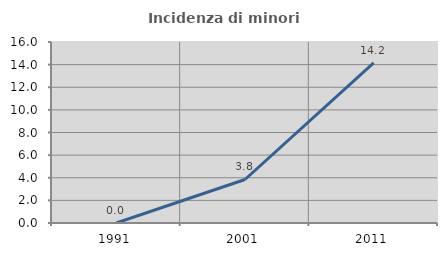
| Category | Incidenza di minori stranieri |
|---|---|
| 1991.0 | 0 |
| 2001.0 | 3.846 |
| 2011.0 | 14.151 |